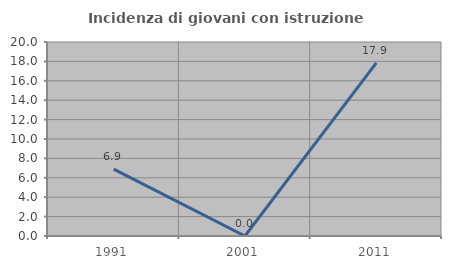
| Category | Incidenza di giovani con istruzione universitaria |
|---|---|
| 1991.0 | 6.897 |
| 2001.0 | 0 |
| 2011.0 | 17.857 |